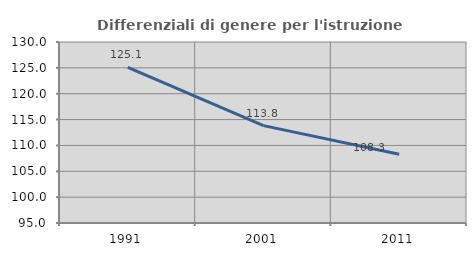
| Category | Differenziali di genere per l'istruzione superiore |
|---|---|
| 1991.0 | 125.092 |
| 2001.0 | 113.826 |
| 2011.0 | 108.286 |